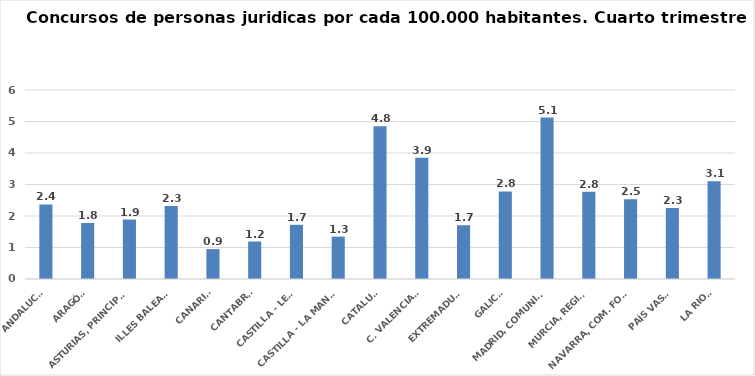
| Category | Series 0 |
|---|---|
| ANDALUCÍA | 2.367 |
| ARAGÓN | 1.779 |
| ASTURIAS, PRINCIPADO | 1.888 |
| ILLES BALEARS | 2.32 |
| CANARIAS | 0.949 |
| CANTABRIA | 1.189 |
| CASTILLA - LEÓN | 1.721 |
| CASTILLA - LA MANCHA | 1.346 |
| CATALUÑA | 4.849 |
| C. VALENCIANA | 3.852 |
| EXTREMADURA | 1.707 |
| GALICIA | 2.778 |
| MADRID, COMUNIDAD | 5.125 |
| MURCIA, REGIÓN | 2.769 |
| NAVARRA, COM. FORAL | 2.529 |
| PAÍS VASCO | 2.252 |
| LA RIOJA | 3.103 |